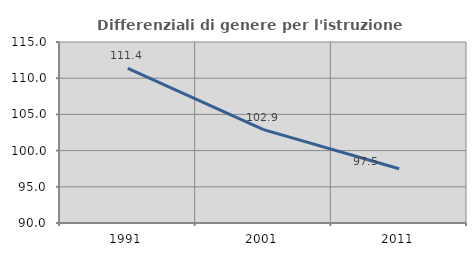
| Category | Differenziali di genere per l'istruzione superiore |
|---|---|
| 1991.0 | 111.352 |
| 2001.0 | 102.893 |
| 2011.0 | 97.499 |